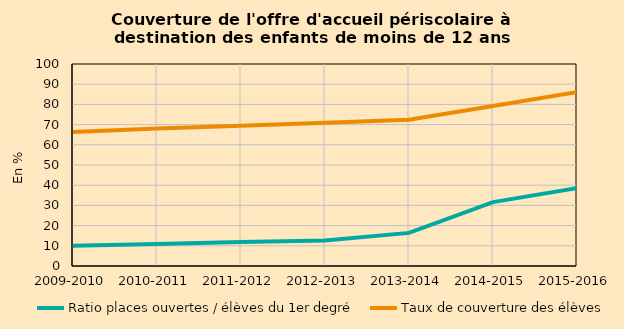
| Category | Ratio places ouvertes / élèves du 1er degré | Taux de couverture des élèves |
|---|---|---|
| 2009-2010 | 10.037 | 66.328 |
| 2010-2011 | 10.84 | 68.124 |
| 2011-2012 | 11.913 | 69.409 |
| 2012-2013 | 12.598 | 70.868 |
| 2013-2014 | 16.394 | 72.359 |
| 2014-2015 | 31.631 | 79.199 |
| 2015-2016 | 38.545 | 86.124 |